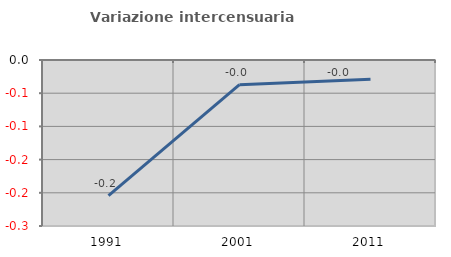
| Category | Variazione intercensuaria annua |
|---|---|
| 1991.0 | -0.204 |
| 2001.0 | -0.037 |
| 2011.0 | -0.029 |